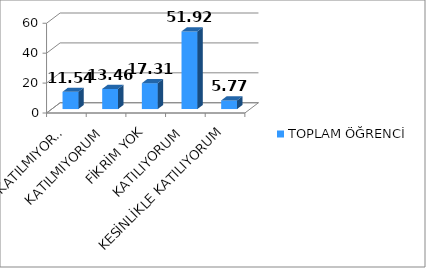
| Category | TOPLAM ÖĞRENCİ |
|---|---|
| KESİNLİKLE KATILMIYORUM | 11.54 |
| KATILMIYORUM | 13.46 |
| FİKRİM YOK | 17.31 |
| KATILIYORUM | 51.92 |
| KESİNLİKLE KATILIYORUM | 5.77 |